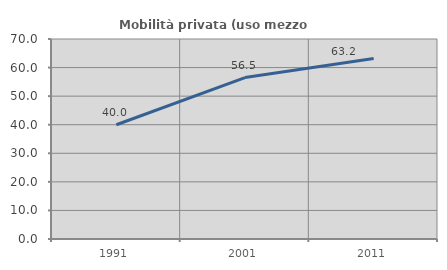
| Category | Mobilità privata (uso mezzo privato) |
|---|---|
| 1991.0 | 39.995 |
| 2001.0 | 56.51 |
| 2011.0 | 63.158 |